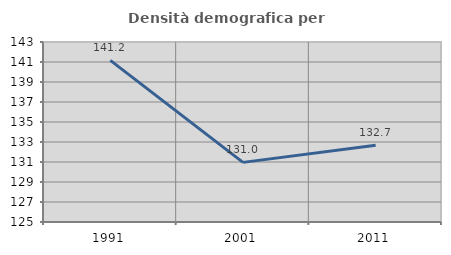
| Category | Densità demografica |
|---|---|
| 1991.0 | 141.167 |
| 2001.0 | 130.961 |
| 2011.0 | 132.678 |